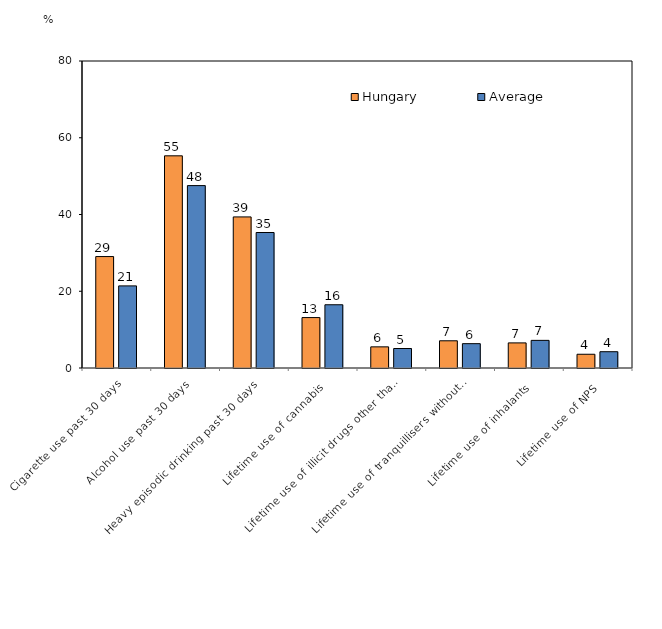
| Category | Hungary | Average |
|---|---|---|
| Cigarette use past 30 days | 29.04 | 21.397 |
| Alcohol use past 30 days | 55.29 | 47.531 |
| Heavy episodic drinking past 30 days | 39.37 | 35.309 |
| Lifetime use of cannabis | 13.14 | 16.48 |
| Lifetime use of illicit drugs other than cannabis | 5.51 | 5.079 |
| Lifetime use of tranquillisers without prescription  | 7.09 | 6.34 |
| Lifetime use of inhalants | 6.54 | 7.202 |
| Lifetime use of NPS | 3.58 | 4.246 |